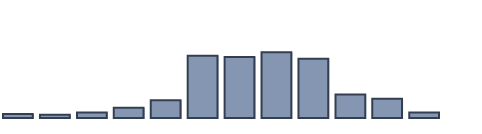
| Category | Series 0 |
|---|---|
| 0 | 1.203 |
| 1 | 0.953 |
| 2 | 1.641 |
| 3 | 3.053 |
| 4 | 5.228 |
| 5 | 18.428 |
| 6 | 18.111 |
| 7 | 19.52 |
| 8 | 17.552 |
| 9 | 6.978 |
| 10 | 5.708 |
| 11 | 1.623 |
| 12 | 0 |